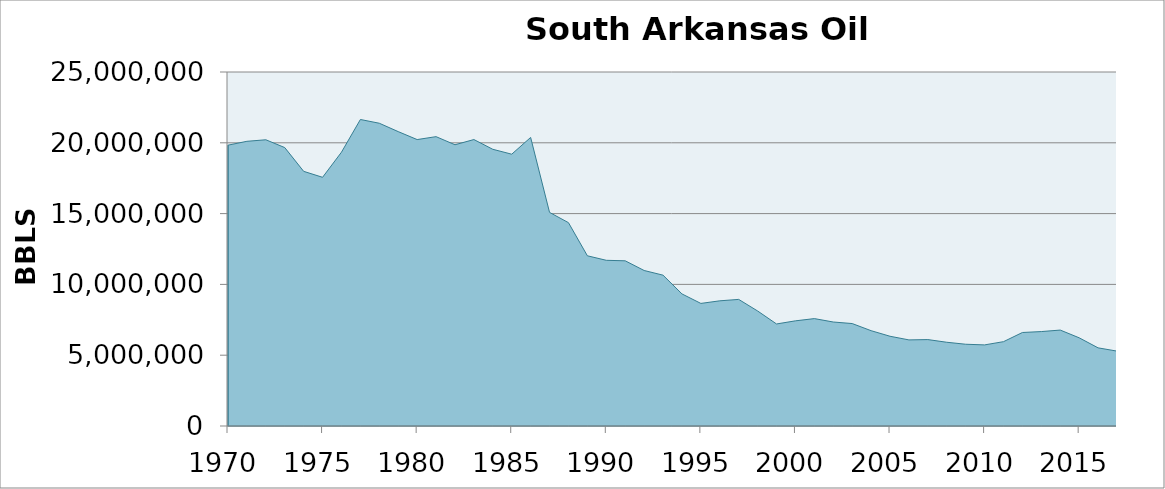
| Category | Oil Production (Bbls) |
|---|---|
| 1970.0 | 19832623 |
| 1971.0 | 20105390 |
| 1972.0 | 20213926 |
| 1973.0 | 19662644 |
| 1974.0 | 17984829 |
| 1975.0 | 17563742 |
| 1976.0 | 19338242 |
| 1977.0 | 21646084 |
| 1978.0 | 21381753 |
| 1979.0 | 20790271 |
| 1980.0 | 20228219 |
| 1981.0 | 20434615 |
| 1982.0 | 19861665 |
| 1983.0 | 20229240 |
| 1984.0 | 19541919 |
| 1985.0 | 19195678 |
| 1986.0 | 20378529 |
| 1987.0 | 15084245 |
| 1988.0 | 14360462 |
| 1989.0 | 12020590 |
| 1990.0 | 11701558 |
| 1991.0 | 11666572 |
| 1992.0 | 10981804 |
| 1993.0 | 10652263 |
| 1994.0 | 9327784 |
| 1995.0 | 8657522 |
| 1996.0 | 8840285 |
| 1997.0 | 8940285 |
| 1998.0 | 8122985 |
| 1999.0 | 7206599 |
| 2000.0 | 7426385 |
| 2001.0 | 7584238 |
| 2002.0 | 7344194 |
| 2003.0 | 7234727 |
| 2004.0 | 6732190 |
| 2005.0 | 6338216 |
| 2006.0 | 6080637 |
| 2007.0 | 6102538 |
| 2008.0 | 5913563 |
| 2009.0 | 5773361 |
| 2010.0 | 5727139 |
| 2011.0 | 5955838 |
| 2012.0 | 6603781 |
| 2013.0 | 6668545 |
| 2014.0 | 6775169 |
| 2015.0 | 6228375 |
| 2016.0 | 5518894 |
| 2017.0 | 5288375 |